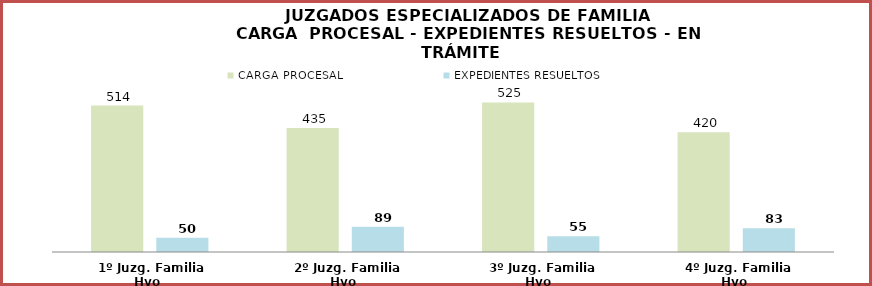
| Category | CARGA PROCESAL | EXPEDIENTES RESUELTOS |
|---|---|---|
| 1º Juzg. Familia Hyo | 514 | 50 |
| 2º Juzg. Familia Hyo | 435 | 89 |
| 3º Juzg. Familia Hyo | 525 | 55 |
| 4º Juzg. Familia Hyo | 420 | 83 |